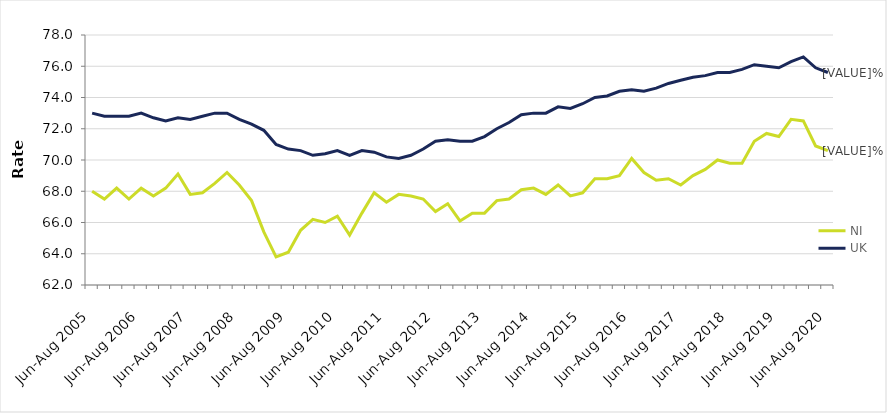
| Category | NI | UK |
|---|---|---|
| Jun-Aug 2005 | 68 | 73 |
| Sep-Nov 2005 | 67.5 | 72.8 |
| Dec-Feb 2006 | 68.2 | 72.8 |
| Mar-May 2006 | 67.5 | 72.8 |
| Jun-Aug 2006 | 68.2 | 73 |
| Sep-Nov 2006 | 67.7 | 72.7 |
| Dec-Feb 2007 | 68.2 | 72.5 |
| Mar-May 2007 | 69.1 | 72.7 |
| Jun-Aug 2007 | 67.8 | 72.6 |
| Sep-Nov 2007 | 67.9 | 72.8 |
| Dec-Feb 2008 | 68.5 | 73 |
| Mar-May 2008 | 69.2 | 73 |
| Jun-Aug 2008 | 68.4 | 72.6 |
| Sep-Nov 2008 | 67.4 | 72.3 |
| Dec-Feb 2009 | 65.4 | 71.9 |
| Mar-May 2009 | 63.8 | 71 |
| Jun-Aug 2009 | 64.1 | 70.7 |
| Sep-Nov 2009 | 65.5 | 70.6 |
| Dec-Feb 2010 | 66.2 | 70.3 |
| Mar-May 2010 | 66 | 70.4 |
| Jun-Aug 2010 | 66.4 | 70.6 |
| Sep-Nov 2010 | 65.2 | 70.3 |
| Dec-Feb 2011 | 66.6 | 70.6 |
| Mar-May 2011 | 67.9 | 70.5 |
| Jun-Aug 2011 | 67.3 | 70.2 |
| Sep-Nov 2011 | 67.8 | 70.1 |
| Dec-Feb 2012 | 67.7 | 70.3 |
| Mar-May 2012 | 67.5 | 70.7 |
| Jun-Aug 2012 | 66.7 | 71.2 |
| Sep-Nov 2012 | 67.2 | 71.3 |
| Dec-Feb 2013 | 66.1 | 71.2 |
| Mar-May 2013 | 66.6 | 71.2 |
| Jun-Aug 2013 | 66.6 | 71.5 |
| Sep-Nov 2013 | 67.4 | 72 |
| Dec-Feb 2014 | 67.5 | 72.4 |
| Mar-May 2014 | 68.1 | 72.9 |
| Jun-Aug 2014 | 68.2 | 73 |
| Sep-Nov 2014 | 67.8 | 73 |
| Dec-Feb 2015 | 68.4 | 73.4 |
| Mar-May 2015 | 67.7 | 73.3 |
| Jun-Aug 2015 | 67.9 | 73.6 |
| Sep-Nov 2015 | 68.8 | 74 |
| Dec-Feb 2016 | 68.8 | 74.1 |
| Mar-May 2016 | 69 | 74.4 |
| Jun-Aug 2016 | 70.1 | 74.5 |
| Sep-Nov 2016 | 69.2 | 74.4 |
| Dec-Feb 2017 | 68.7 | 74.6 |
| Mar-May 2017 | 68.8 | 74.9 |
| Jun-Aug 2017 | 68.4 | 75.1 |
| Sep-Nov 2017 | 69 | 75.3 |
| Dec-Feb 2018 | 69.4 | 75.4 |
| Mar-May 2018 | 70 | 75.6 |
| Jun-Aug 2018 | 69.8 | 75.6 |
| Sep-Nov 2018 | 69.8 | 75.8 |
| Dec-Feb 2019 | 71.2 | 76.1 |
| Mar-May 2019 | 71.7 | 76 |
| Jun-Aug 2019 | 71.5 | 75.9 |
| Sep-Nov 2019 | 72.6 | 76.3 |
| Dec-Feb 2020 | 72.5 | 76.6 |
| Mar-May 2020 | 70.9 | 75.9 |
| Jun-Aug 2020 | 70.6 | 75.6 |